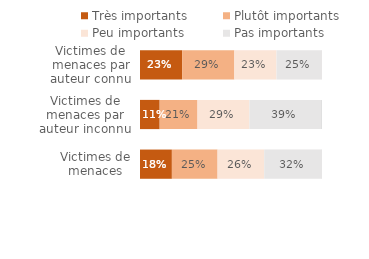
| Category | Très importants | Plutôt importants | Peu importants | Pas importants | Ne sait pas/Refus |
|---|---|---|---|---|---|
| Victimes de menaces | 0.175 | 0.251 | 0.256 | 0.315 | 0.003 |
| Victimes de menaces par auteur inconnu | 0.108 | 0.208 | 0.285 | 0.395 | 0.004 |
| Victimes de menaces par auteur connu | 0.231 | 0.287 | 0.231 | 0.249 | 0.001 |